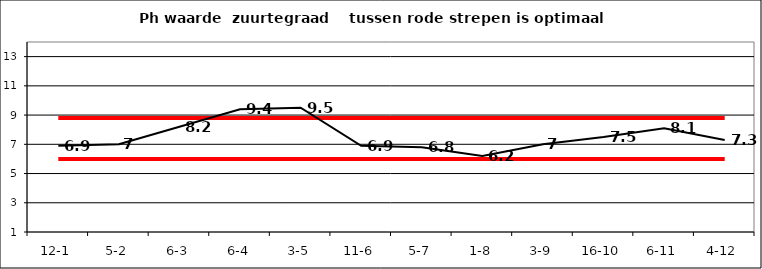
| Category | Series 0 | Series 1 | Series 2 |
|---|---|---|---|
| 12-1 | 8.8 | 6 | 6.9 |
| 5-2 | 8.8 | 6 | 7 |
| 6-3 | 8.8 | 6 | 8.2 |
| 6-4 | 8.8 | 6 | 9.4 |
| 3-5 | 8.8 | 6 | 9.5 |
| 11-6 | 8.8 | 6 | 6.9 |
| 5-7 | 8.8 | 6 | 6.8 |
| 1-8 | 8.8 | 6 | 6.2 |
| 3-9 | 8.8 | 6 | 7 |
| 16-10 | 8.8 | 6 | 7.5 |
| 6-11 | 8.8 | 6 | 8.1 |
| 4-12 | 8.8 | 6 | 7.3 |